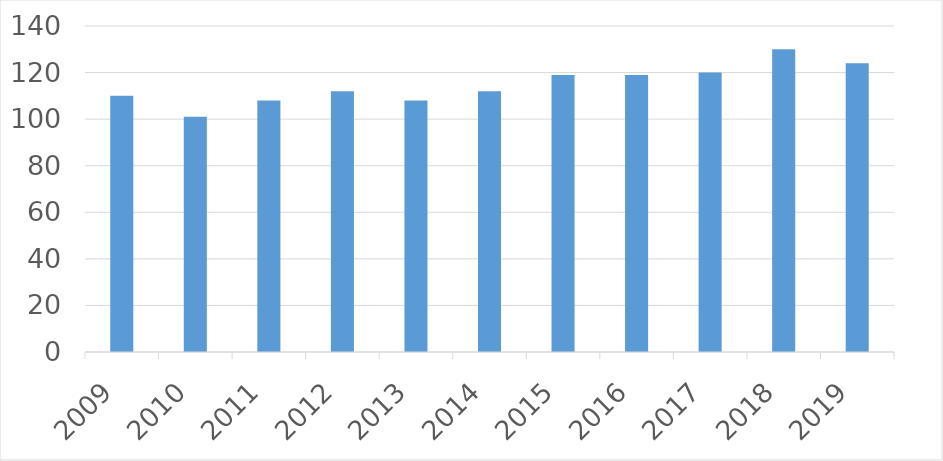
| Category | Series 0 |
|---|---|
| 2009 | 110 |
| 2010 | 101 |
| 2011 | 108 |
| 2012 | 112 |
| 2013 | 108 |
| 2014 | 112 |
| 2015 | 119 |
| 2016 | 119 |
| 2017 | 120 |
| 2018 | 130 |
| 2019 | 124 |